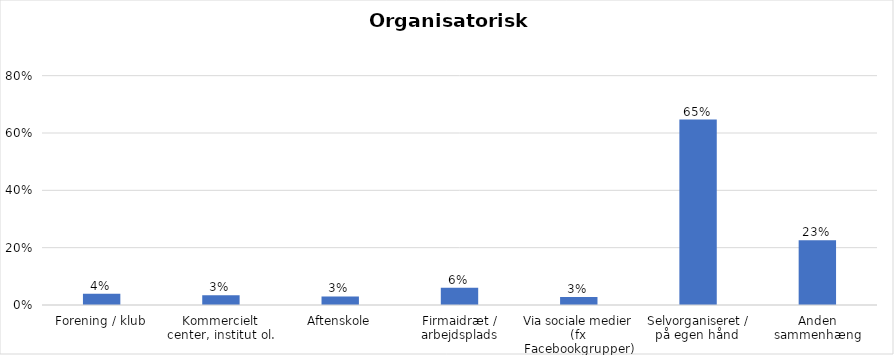
| Category | % |
|---|---|
| Forening / klub | 0.039 |
| Kommercielt center, institut ol. | 0.034 |
| Aftenskole | 0.03 |
| Firmaidræt / arbejdsplads | 0.06 |
| Via sociale medier (fx Facebookgrupper) | 0.028 |
| Selvorganiseret / på egen hånd  | 0.647 |
| Anden sammenhæng | 0.226 |